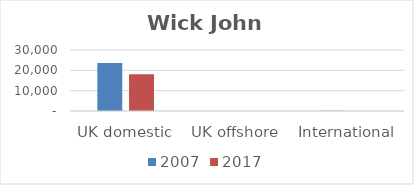
| Category | 2007 | 2017 |
|---|---|---|
| UK domestic | 23572 | 18060 |
| UK offshore | 14 | 4 |
| International | 137 | 0 |